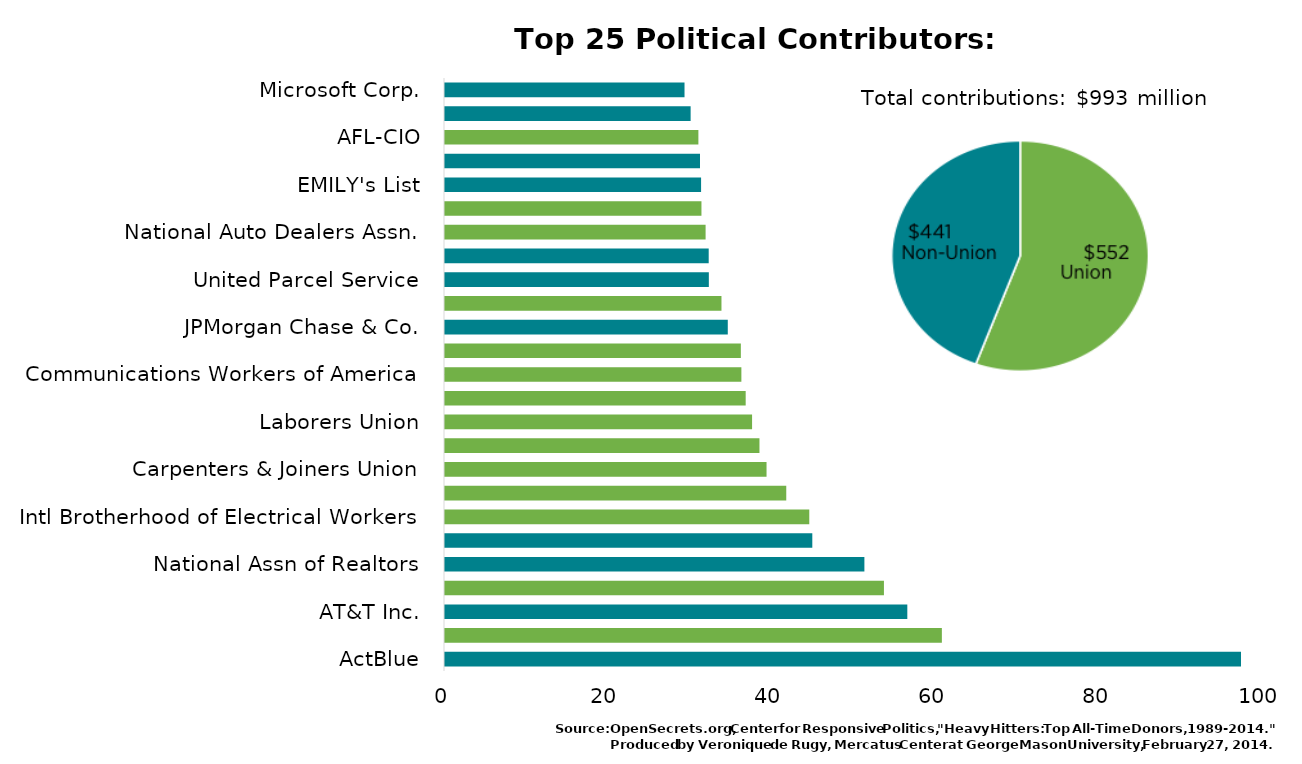
| Category | Series 0 |
|---|---|
| ActBlue | 97.192 |
| AFSCME | 60.667 |
| AT&T Inc. | 56.449 |
| National Education Assn. | 53.594 |
| National Assn of Realtors | 51.208 |
| Goldman Sachs | 44.848 |
| Intl Brotherhood of Electrical Workers | 44.479 |
| United Auto Workers | 41.668 |
| Carpenters & Joiners Union | 39.26 |
| Service Employees International Union | 38.396 |
| Laborers Union | 37.494 |
| American Federation of Teachers | 36.713 |
| Communications Workers of America | 36.188 |
| Teamsters Union | 36.123 |
| JPMorgan Chase & Co. | 34.527 |
| United Food & Commercial Workers Union | 33.757 |
| United Parcel Service | 32.214 |
| Citigroup Inc. | 32.198 |
| National Auto Dealers Assn. | 31.819 |
| Machinists & Aerospace Workers Union | 31.313 |
| EMILY's List | 31.268 |
| American Bankers Assn. | 31.135 |
| AFL-CIO | 30.939 |
| American Medical Assn. | 29.991 |
| Microsoft Corp. | 29.245 |